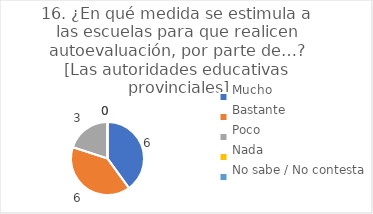
| Category | 16. ¿En qué medida se estimula a las escuelas para que realicen autoevaluación, por parte de…?
[Las autoridades educativas provinciales] |
|---|---|
| Mucho  | 0.4 |
| Bastante  | 0.4 |
| Poco  | 0.2 |
| Nada  | 0 |
| No sabe / No contesta | 0 |